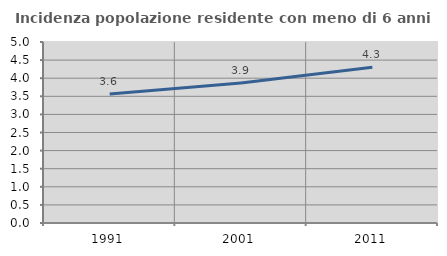
| Category | Incidenza popolazione residente con meno di 6 anni |
|---|---|
| 1991.0 | 3.562 |
| 2001.0 | 3.865 |
| 2011.0 | 4.301 |